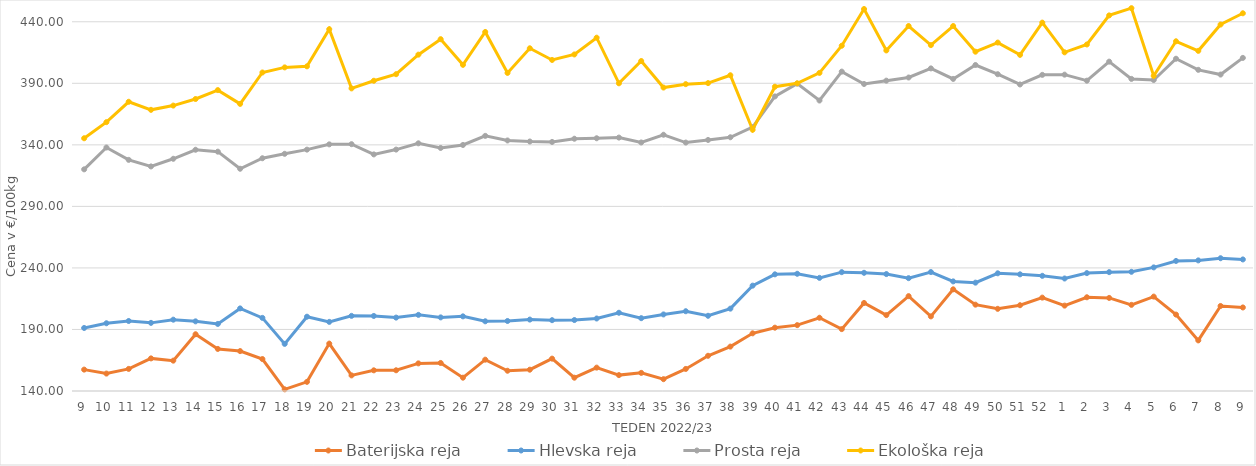
| Category | Baterijska reja | Hlevska reja | Prosta reja | Ekološka reja |
|---|---|---|---|---|
| 9.0 | 157.38 | 191.21 | 320.1 | 345.35 |
| 10.0 | 154.16 | 195.04 | 337.83 | 358.45 |
| 11.0 | 157.96 | 196.88 | 327.79 | 375 |
| 12.0 | 166.49 | 195.36 | 322.46 | 368.45 |
| 13.0 | 164.66 | 197.95 | 328.67 | 371.9 |
| 14.0 | 186.11 | 196.59 | 336.02 | 377.24 |
| 15.0 | 174.18 | 194.49 | 334.46 | 384.48 |
| 16.0 | 172.42 | 207.1 | 320.58 | 373.28 |
| 17.0 | 165.96 | 199.41 | 329.11 | 398.79 |
| 18.0 | 141.36 | 178.29 | 332.71 | 402.93 |
| 19.0 | 147.43 | 200.37 | 336.11 | 403.79 |
| 20.0 | 178.51 | 196.16 | 340.4 | 433.97 |
| 21.0 | 152.67 | 201.05 | 340.55 | 385.86 |
| 22.0 | 156.8 | 200.98 | 332.23 | 392.07 |
| 23.0 | 156.84 | 199.63 | 336.16 | 397.41 |
| 24.0 | 162.44 | 201.86 | 341.24 | 413.28 |
| 25.0 | 162.78 | 199.81 | 337.48 | 425.86 |
| 26.0 | 150.82 | 200.65 | 339.9 | 405 |
| 27.0 | 165.45 | 196.64 | 347.3 | 431.72 |
| 28.0 | 156.46 | 196.88 | 343.56 | 398.45 |
| 29.0 | 157.31 | 198.03 | 342.71 | 418.45 |
| 30.0 | 166.29 | 197.55 | 342.35 | 408.97 |
| 31.0 | 150.81 | 197.66 | 344.97 | 413.45 |
| 32.0 | 158.99 | 198.9 | 345.35 | 427.07 |
| 33.0 | 152.91 | 203.57 | 345.9 | 390 |
| 34.0 | 154.73 | 199.17 | 341.92 | 408.1 |
| 35.0 | 149.6 | 202.21 | 348.2 | 386.55 |
| 36.0 | 157.93 | 204.81 | 341.85 | 389.31 |
| 37.0 | 168.61 | 201.11 | 343.97 | 390.17 |
| 38.0 | 176.07 | 206.91 | 346.16 | 396.55 |
| 39.0 | 186.86 | 225.6 | 354.41 | 352.24 |
| 40.0 | 191.45 | 234.79 | 379.35 | 387.24 |
| 41.0 | 193.52 | 235.24 | 389.75 | 390 |
| 42.0 | 199.51 | 231.92 | 376.02 | 398.45 |
| 43.0 | 190.28 | 236.56 | 399.51 | 420.52 |
| 44.0 | 211.53 | 236.04 | 389.44 | 450.35 |
| 45.0 | 201.69 | 235.01 | 392.15 | 416.72 |
| 46.0 | 217.08 | 231.68 | 394.71 | 436.55 |
| 47.0 | 200.62 | 236.65 | 402.12 | 421.03 |
| 48.0 | 222.61 | 229.05 | 393.56 | 436.55 |
| 49.0 | 210.16 | 228.03 | 404.87 | 415.69 |
| 50.0 | 206.76 | 235.63 | 397.4 | 423.1 |
| 51.0 | 209.69 | 234.79 | 389.05 | 413.1 |
| 52.0 | 215.87 | 233.58 | 396.87 | 439.31 |
| 1.0 | 209.37 | 231.41 | 397.04 | 415.17 |
| 2.0 | 216.15 | 235.78 | 392.13 | 421.55 |
| 3.0 | 215.63 | 236.58 | 407.61 | 445.17 |
| 4.0 | 210 | 236.85 | 393.58 | 451.04 |
| 5.0 | 216.7 | 240.42 | 392.67 | 396.03 |
| 6.0 | 202.1 | 245.67 | 409.97 | 424.14 |
| 7.0 | 181.11 | 246.12 | 400.94 | 416.38 |
| 8.0 | 209.08 | 247.88 | 397.11 | 437.76 |
| 9.0 | 207.87 | 246.89 | 410.64 | 446.9 |